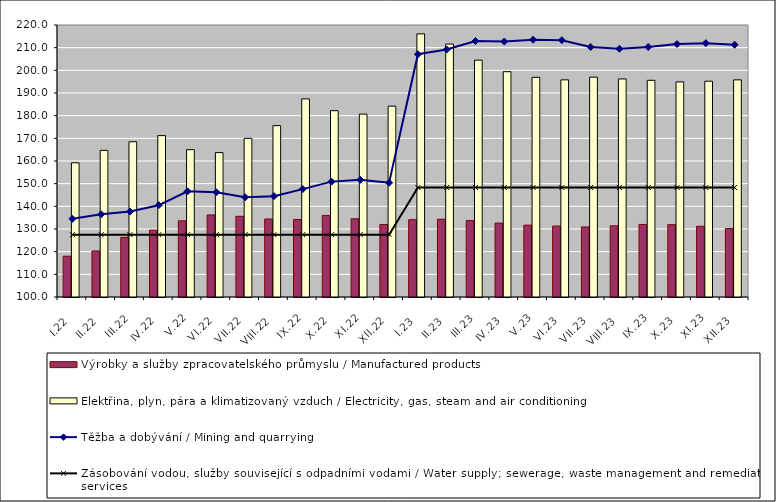
| Category | Výrobky a služby zpracovatelského průmyslu / Manufactured products | Elektřina, plyn, pára a klimatizovaný vzduch / Electricity, gas, steam and air conditioning |
|---|---|---|
| I.22 | 118 | 159.2 |
| II.22 | 120.3 | 164.7 |
| III.22 | 126.3 | 168.5 |
| IV.22 | 129.5 | 171.2 |
| V.22 | 133.6 | 165 |
| VI.22 | 136.2 | 163.7 |
| VII.22 | 135.6 | 170 |
| VIII.22 | 134.4 | 175.6 |
| IX.22 | 134.2 | 187.4 |
| X.22 | 136 | 182.2 |
| XI.22 | 134.5 | 180.7 |
| XII.22 | 132 | 184.2 |
| I.23 | 134.1 | 216.1 |
| II.23 | 134.3 | 211.6 |
| III.23 | 133.7 | 204.5 |
| IV.23 | 132.6 | 199.4 |
| V.23 | 131.7 | 196.9 |
| VI.23 | 131.3 | 195.8 |
| VII.23 | 130.9 | 197 |
| VIII.23 | 131.4 | 196.2 |
| IX.23 | 132 | 195.6 |
| X.23 | 131.9 | 194.9 |
| XI.23 | 131.2 | 195.2 |
| XII.23 | 130.2 | 195.8 |